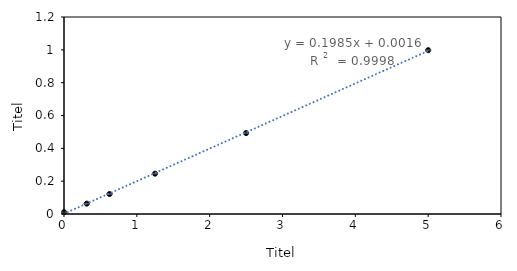
| Category | Series 0 |
|---|---|
| 5.0 | 0.998 |
| 2.5 | 0.493 |
| 1.25 | 0.246 |
| 0.625 | 0.122 |
| 0.3125 | 0.063 |
| 0.0 | 0.011 |